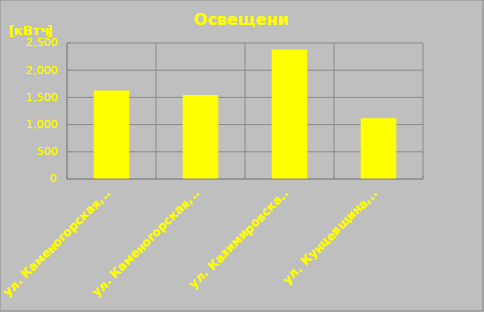
| Category | Series 0 |
|---|---|
| ул. Каменогорская, 30 | 1624.98 |
| ул. Каменогорская, 86 | 1543.074 |
| ул. Казимировская, 9 | 2379.362 |
| ул. Кунцевщина, 35 | 1116.973 |